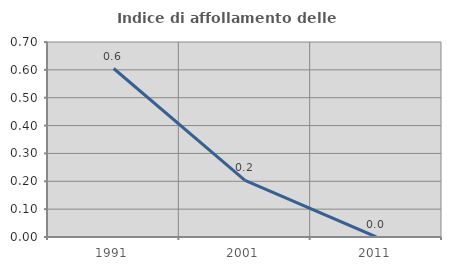
| Category | Indice di affollamento delle abitazioni  |
|---|---|
| 1991.0 | 0.605 |
| 2001.0 | 0.203 |
| 2011.0 | 0 |